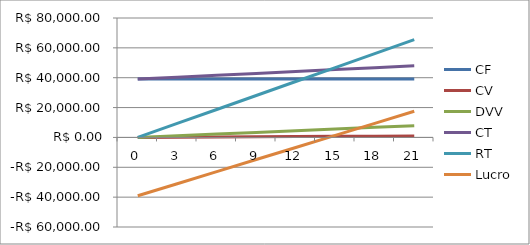
| Category | CF | CV | DVV | CT | RT | Lucro |
|---|---|---|---|---|---|---|
| 0.0 | 39100 | 0 | 0 | 39100 | 0 | -39100 |
| 3.0 | 39100 | 144 | 1123.2 | 40367.2 | 9360 | -31007.2 |
| 6.0 | 39100 | 288 | 2246.4 | 41634.4 | 18720 | -22914.4 |
| 9.0 | 39100 | 432 | 3369.6 | 42901.6 | 28080 | -14821.6 |
| 12.0 | 39100 | 576 | 4492.8 | 44168.8 | 37440 | -6728.8 |
| 15.0 | 39100 | 720 | 5616 | 45436 | 46800 | 1364 |
| 18.0 | 39100 | 864 | 6739.2 | 46703.2 | 56160 | 9456.8 |
| 21.0 | 39100 | 1008 | 7862.4 | 47970.4 | 65520 | 17549.6 |